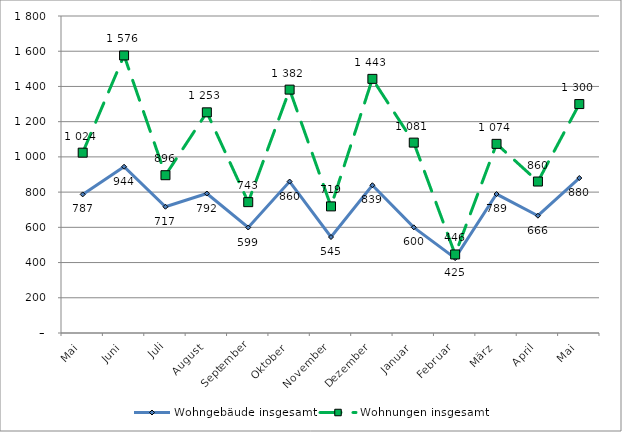
| Category | Wohngebäude insgesamt | Wohnungen insgesamt |
|---|---|---|
| Mai | 787 | 1024 |
| Juni | 944 | 1576 |
| Juli | 717 | 896 |
| August | 792 | 1253 |
| September | 599 | 743 |
| Oktober | 860 | 1382 |
| November | 545 | 719 |
| Dezember | 839 | 1443 |
| Januar | 600 | 1081 |
| Februar | 425 | 446 |
| März | 789 | 1074 |
| April | 666 | 860 |
| Mai | 880 | 1300 |